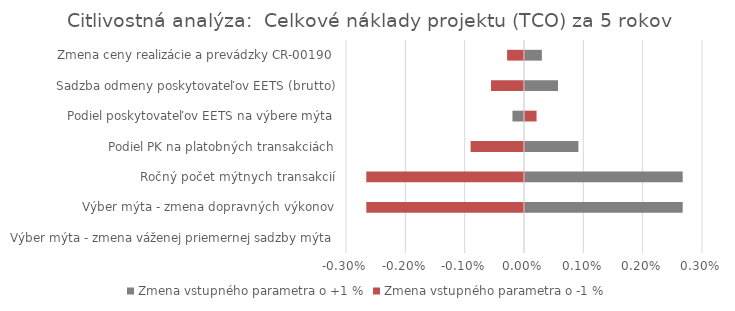
| Category | Zmena vstupného parametra o +1 % | Zmena vstupného parametra o -1 % |
|---|---|---|
| Výber mýta - zmena váženej priemernej sadzby mýta | 0 | 0 |
| Výber mýta - zmena dopravných výkonov | 0.003 | -0.003 |
| Ročný počet mýtnych transakcií | 0.003 | -0.003 |
| Podiel PK na platobných transakciách | 0.001 | -0.001 |
| Podiel poskytovateľov EETS na výbere mýta | 0 | 0 |
| Sadzba odmeny poskytovateľov EETS (brutto) | 0.001 | -0.001 |
| Zmena ceny realizácie a prevádzky CR-00190 | 0 | 0 |